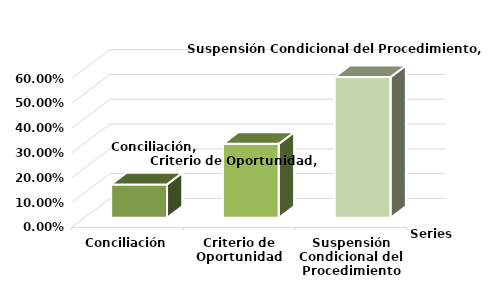
| Category | Series 0 |
|---|---|
| Conciliación | 0.135 |
| Criterio de Oportunidad | 0.298 |
| Suspensión Condicional del Procedimiento | 0.567 |